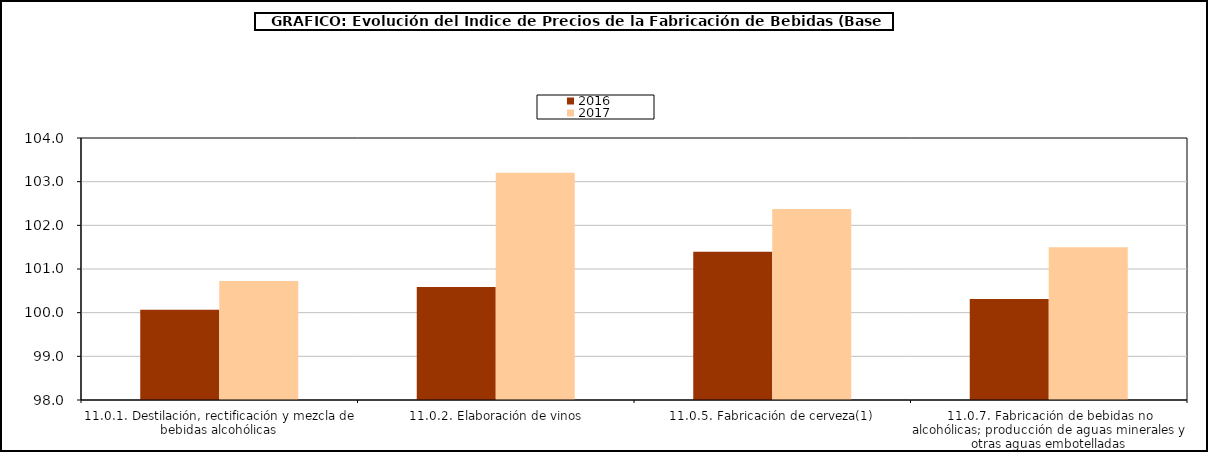
| Category | 2016 | 2017 |
|---|---|---|
| 11.0.1. Destilación, rectificación y mezcla de bebidas alcohólicas | 100.066 | 100.724 |
| 11.0.2. Elaboración de vinos | 100.587 | 103.203 |
| 11.0.5. Fabricación de cerveza(1) | 101.393 | 102.376 |
| 11.0.7. Fabricación de bebidas no alcohólicas; producción de aguas minerales y otras aguas embotelladas | 100.313 | 101.496 |